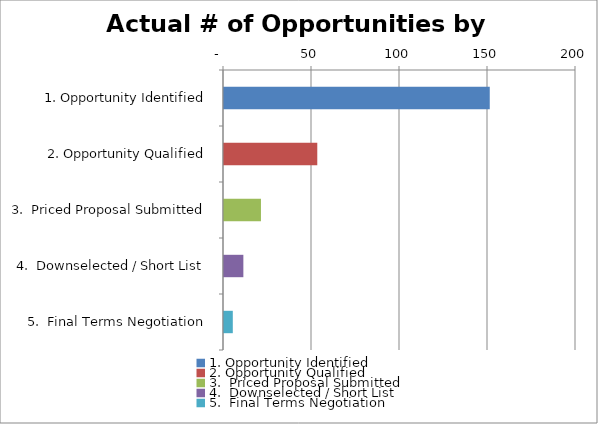
| Category | # of Opptys |
|---|---|
| 1. Opportunity Identified | 151 |
| 2. Opportunity Qualified | 53 |
| 3.  Priced Proposal Submitted | 21 |
| 4.  Downselected / Short List | 11 |
| 5.  Final Terms Negotiation | 5 |